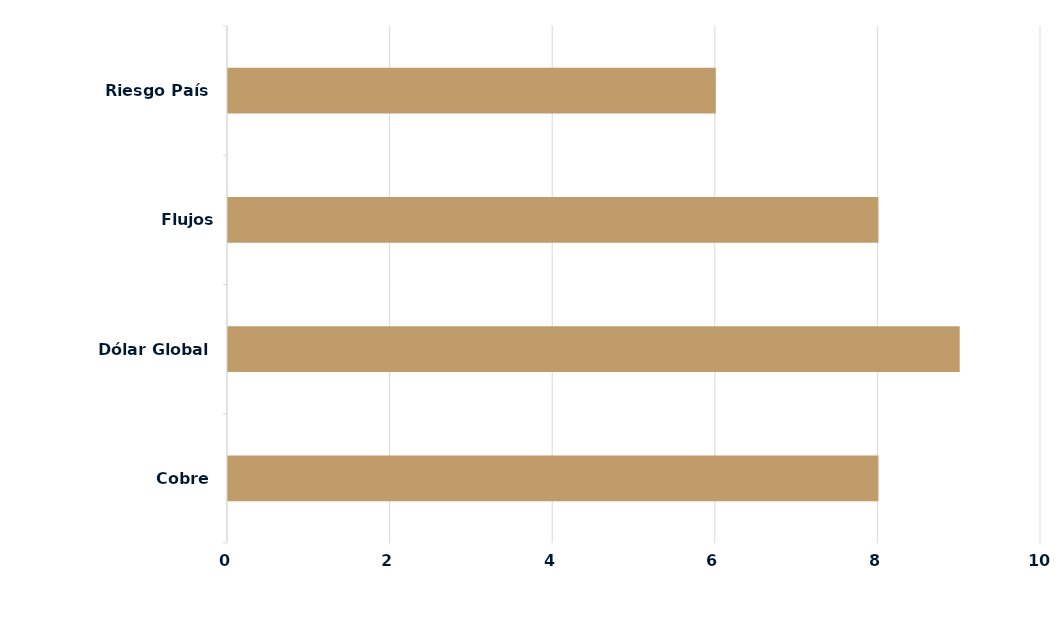
| Category | Series 0 |
|---|---|
| Cobre | 8 |
| Dólar Global | 9 |
| Flujos Locales/Extranjeros | 8 |
| Riesgo País | 6 |